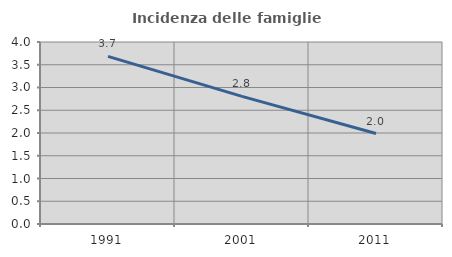
| Category | Incidenza delle famiglie numerose |
|---|---|
| 1991.0 | 3.685 |
| 2001.0 | 2.805 |
| 2011.0 | 1.988 |